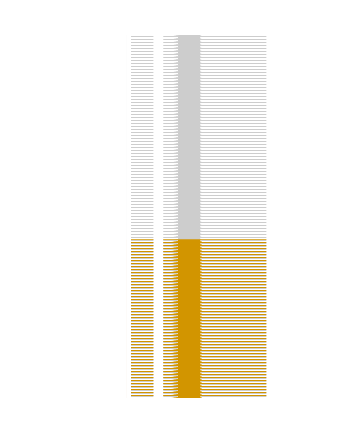
| Category | Series 1 |
|---|---|
| Percentage of women who received at least 2 doses during pregnancy | 100 |